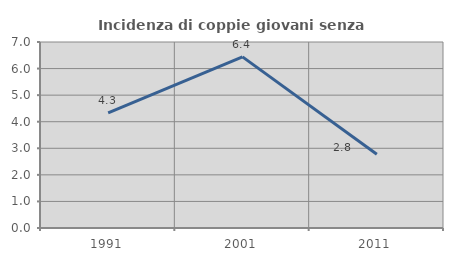
| Category | Incidenza di coppie giovani senza figli |
|---|---|
| 1991.0 | 4.331 |
| 2001.0 | 6.439 |
| 2011.0 | 2.778 |